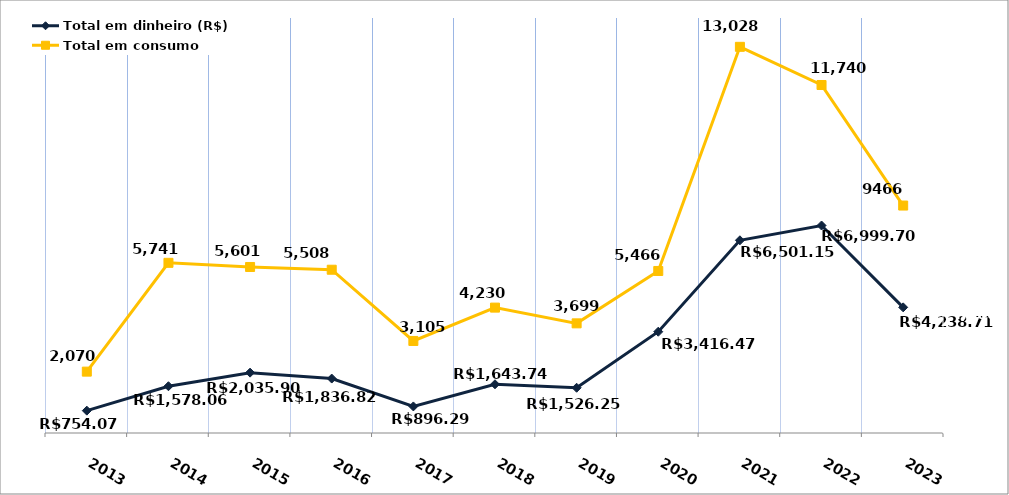
| Category | Total em dinheiro (R$) |
|---|---|
| 2013.0 | 754.07 |
| 2014.0 | 1578.06 |
| 2015.0 | 2035.9 |
| 2016.0 | 1836.82 |
| 2017.0 | 896.29 |
| 2018.0 | 1643.74 |
| 2019.0 | 1526.25 |
| 2020.0 | 3416.47 |
| 2021.0 | 6501.15 |
| 2022.0 | 6999.7 |
| 2023.0 | 4238.71 |